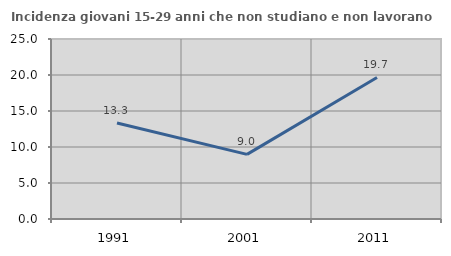
| Category | Incidenza giovani 15-29 anni che non studiano e non lavorano  |
|---|---|
| 1991.0 | 13.333 |
| 2001.0 | 8.974 |
| 2011.0 | 19.658 |